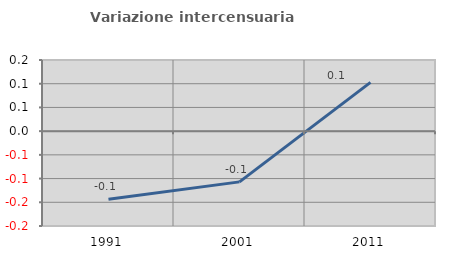
| Category | Variazione intercensuaria annua |
|---|---|
| 1991.0 | -0.144 |
| 2001.0 | -0.107 |
| 2011.0 | 0.103 |